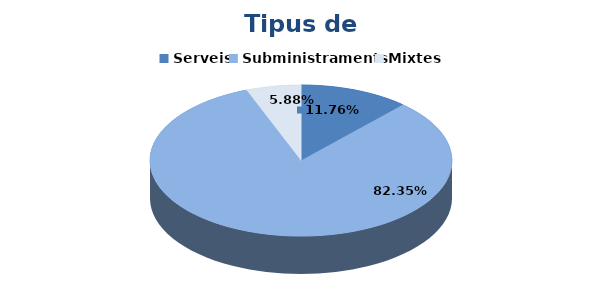
| Category | Series 0 |
|---|---|
| Serveis | 2 |
| Subministraments | 14 |
| Mixtes | 1 |